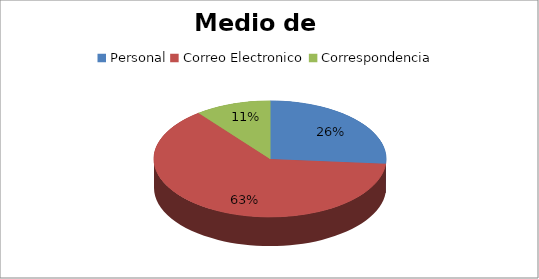
| Category | Series 0 |
|---|---|
| Personal | 5 |
| Correo Electronico | 12 |
| Correspondencia | 2 |